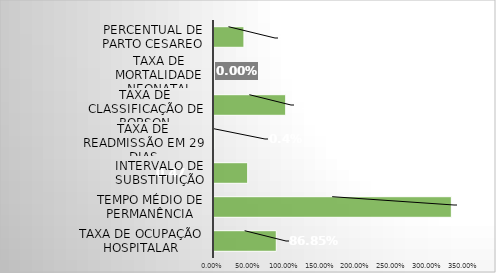
| Category | Series 0 |
|---|---|
| Taxa de Ocupação Hospitalar | 0.868 |
| Tempo Médio de permanência | 3.31 |
| Intervalo de substituição | 0.47 |
| Taxa de readmissão em 29 dias | 0.004 |
| Taxa de classificação de Robson | 1 |
| Taxa de mortalidade neonatal | 0 |
| Percentual de parto cesareo | 0.418 |